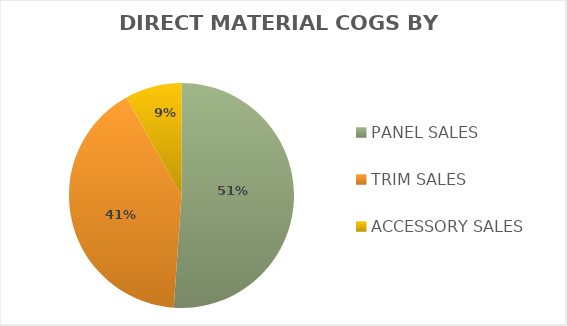
| Category | Series 0 |
|---|---|
| PANEL SALES | 439024.39 |
| TRIM SALES | 350000 |
| ACCESSORY SALES | 70000 |